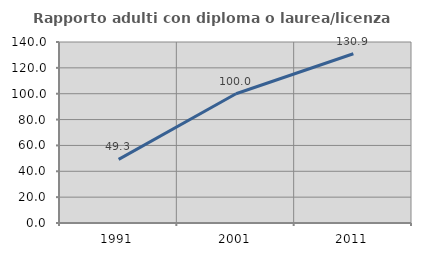
| Category | Rapporto adulti con diploma o laurea/licenza media  |
|---|---|
| 1991.0 | 49.254 |
| 2001.0 | 100 |
| 2011.0 | 130.935 |